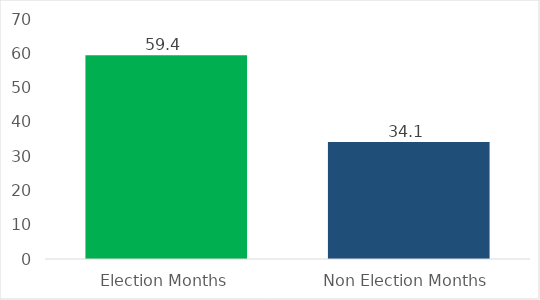
| Category | Average Monthly Payments |
|---|---|
| Election Months | 59.441 |
| Non Election Months | 34.107 |